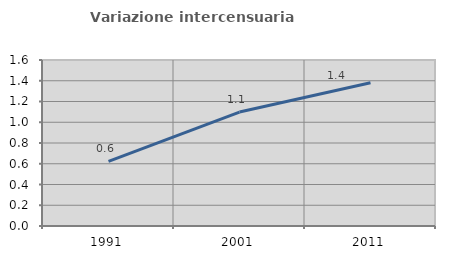
| Category | Variazione intercensuaria annua |
|---|---|
| 1991.0 | 0.623 |
| 2001.0 | 1.098 |
| 2011.0 | 1.381 |